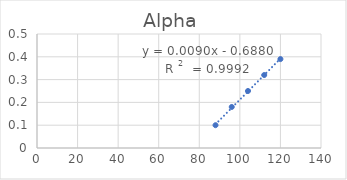
| Category | Series 0 |
|---|---|
| 120.0 | 0.39 |
| 112.0 | 0.32 |
| 104.0 | 0.25 |
| 96.0 | 0.18 |
| 88.0 | 0.1 |